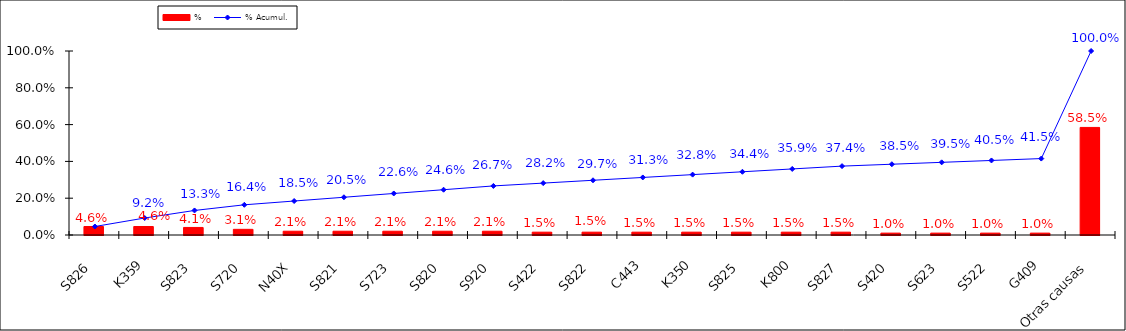
| Category | % |
|---|---|
| S826 | 0.046 |
| K359 | 0.046 |
| S823 | 0.041 |
| S720 | 0.031 |
| N40X | 0.021 |
| S821 | 0.021 |
| S723 | 0.021 |
| S820 | 0.021 |
| S920 | 0.021 |
| S422 | 0.015 |
| S822 | 0.015 |
| C443 | 0.015 |
| K350 | 0.015 |
| S825 | 0.015 |
| K800 | 0.015 |
| S827 | 0.015 |
| S420 | 0.01 |
| S623 | 0.01 |
| S522 | 0.01 |
| G409 | 0.01 |
| Otras causas | 0.585 |